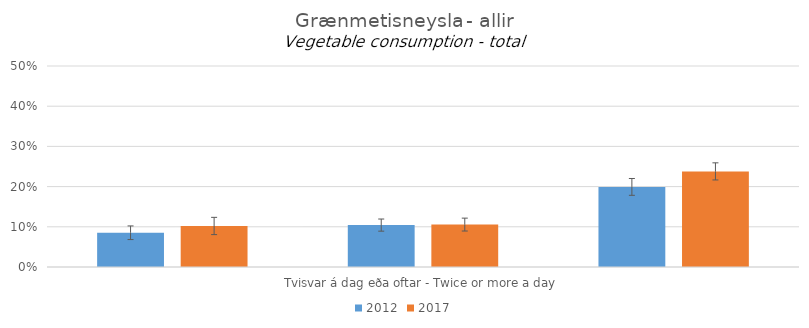
| Category | 2012 | 2017 |
|---|---|---|
| 0 | 0.085 | 0.102 |
| 1 | 0.104 | 0.106 |
| 2 | 0.199 | 0.238 |